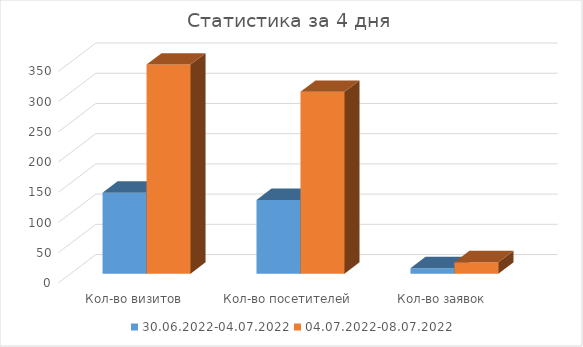
| Category | 30.06.2022-04.07.2022 | 04.07.2022-08.07.2022 |
|---|---|---|
| Кол-во визитов | 134 | 346 |
| Кол-во посетителей | 122 | 301 |
| Кол-во заявок | 9 | 19 |